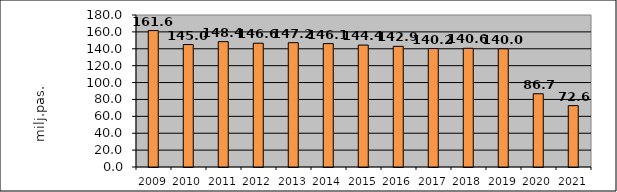
| Category | Series 1 |
|---|---|
| 2009.0 | 161.559 |
| 2010.0 | 145.021 |
| 2011.0 | 148.448 |
| 2012.0 | 146.587 |
| 2013.0 | 147.216 |
| 2014.0 | 146.114 |
| 2015.0 | 144.374 |
| 2016.0 | 142.871 |
| 2017.0 | 140.249 |
| 2018.0 | 140.583 |
| 2019.0 | 139.955 |
| 2020.0 | 86.725 |
| 2021.0 | 72.65 |